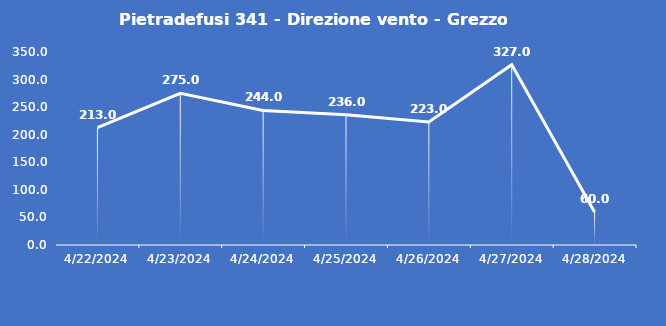
| Category | Pietradefusi 341 - Direzione vento - Grezzo (°N) |
|---|---|
| 4/22/24 | 213 |
| 4/23/24 | 275 |
| 4/24/24 | 244 |
| 4/25/24 | 236 |
| 4/26/24 | 223 |
| 4/27/24 | 327 |
| 4/28/24 | 60 |